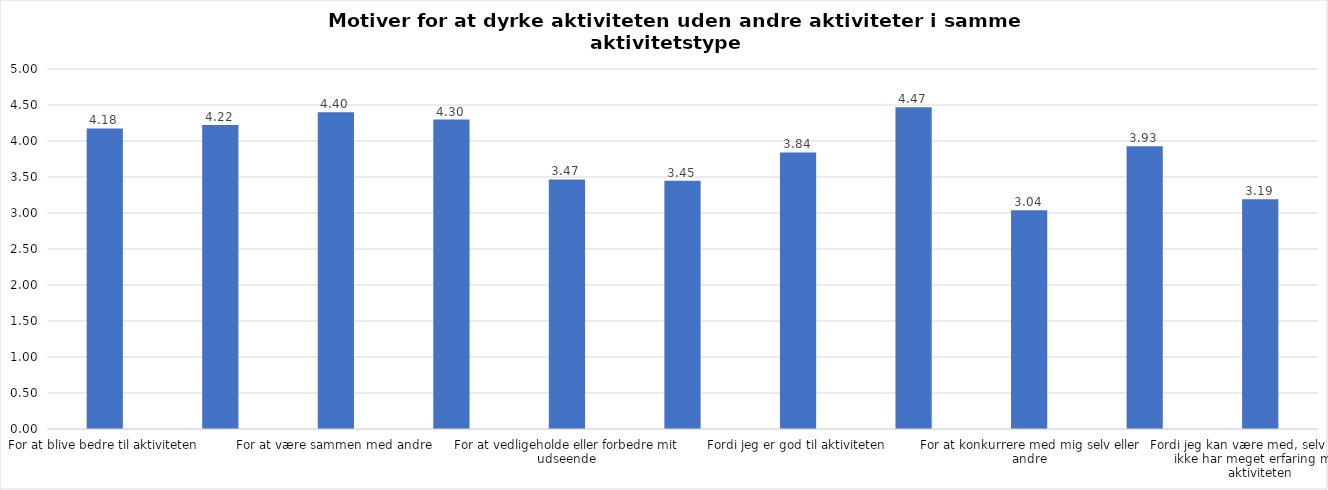
| Category | Gennemsnit |
|---|---|
| For at blive bedre til aktiviteten | 4.175 |
| For at vedligeholde eller forbedre min sundhed (fx helbred, fysisk form) | 4.221 |
| For at være sammen med andre | 4.399 |
| For at gøre noget godt for mig selv | 4.298 |
| For at vedligeholde eller forbedre mit udseende | 3.465 |
| Fordi andre i min omgangskreds opmuntrer mig til det | 3.448 |
| Fordi jeg er god til aktiviteten | 3.841 |
| Fordi jeg godt kan lide aktiviteten | 4.468 |
| For at konkurrere med mig selv eller andre | 3.038 |
| Fordi aktiviteten passer godt ind i min hverdag | 3.926 |
| Fordi jeg kan være med, selv om jeg ikke har meget erfaring med aktiviteten | 3.191 |